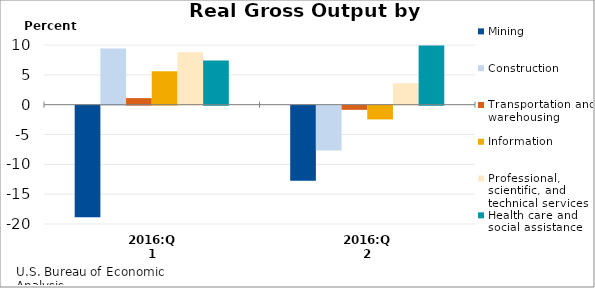
| Category | Mining | Construction | Transportation and warehousing | Information | Professional, scientific, and technical services | Health care and social assistance |
|---|---|---|---|---|---|---|
| 2016:Q1 | -18.7 | 9.4 | 1.1 | 5.6 | 8.8 | 7.4 |
| 2016:Q2 | -12.6 | -7.5 | -0.7 | -2.3 | 3.6 | 9.9 |